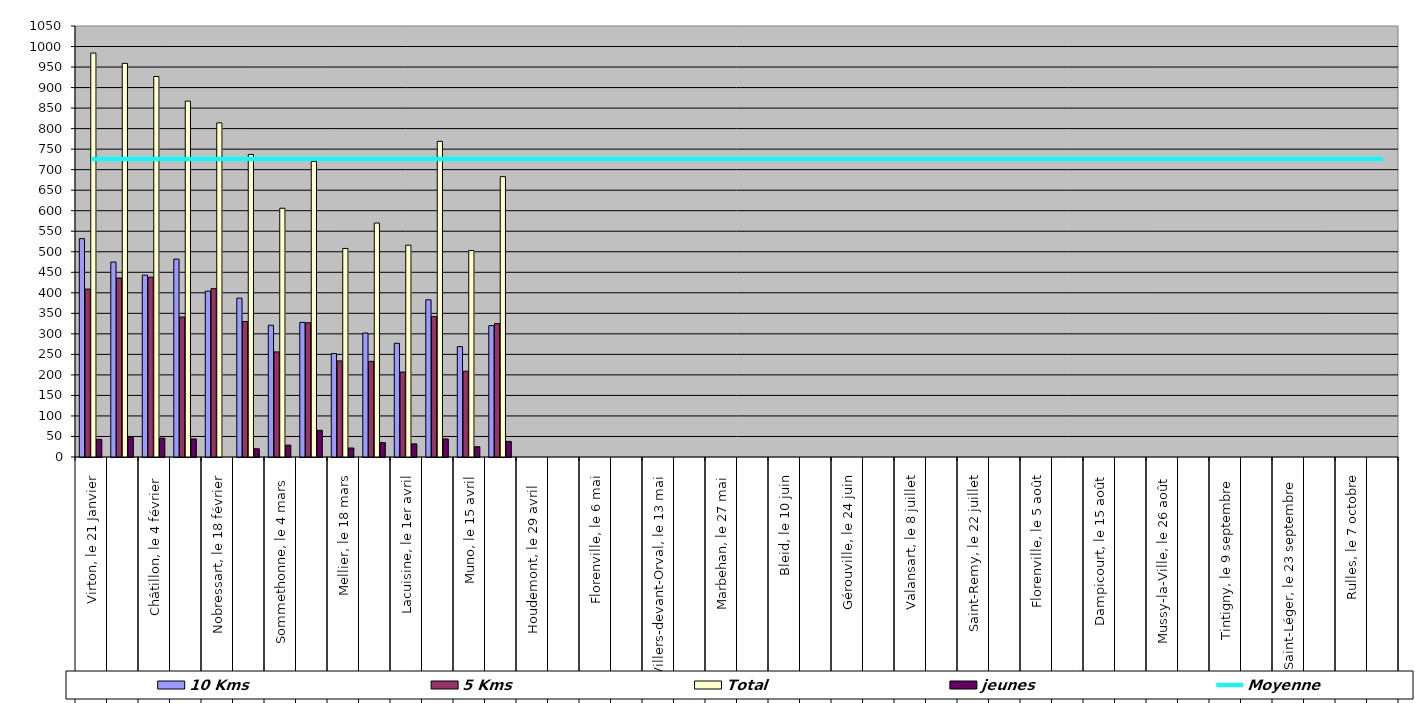
| Category | 10 Kms | 5 Kms | Total | jeunes |
|---|---|---|---|---|
| 0 | 532 | 409 | 984 | 43 |
| 1 | 475 | 436 | 959 | 48 |
| 2 | 443 | 438 | 927 | 46 |
| 3 | 482 | 341 | 867 | 44 |
| 4 | 404 | 410 | 814 | 0 |
| 5 | 387 | 330 | 737 | 20 |
| 6 | 321 | 256 | 606 | 29 |
| 7 | 328 | 327 | 720 | 65 |
| 8 | 252 | 234 | 508 | 22 |
| 9 | 302 | 233 | 570 | 35 |
| 10 | 277 | 207 | 516 | 32 |
| 11 | 383 | 342 | 769 | 44 |
| 12 | 269 | 209 | 503 | 25 |
| 13 | 320 | 325 | 683 | 38 |
| 14 | 0 | 0 | 0 | 0 |
| 15 | 0 | 0 | 0 | 0 |
| 16 | 0 | 0 | 0 | 0 |
| 17 | 0 | 0 | 0 | 0 |
| 18 | 0 | 0 | 0 | 0 |
| 19 | 0 | 0 | 0 | 0 |
| 20 | 0 | 0 | 0 | 0 |
| 21 | 0 | 0 | 0 | 0 |
| 22 | 0 | 0 | 0 | 0 |
| 23 | 0 | 0 | 0 | 0 |
| 24 | 0 | 0 | 0 | 0 |
| 25 | 0 | 0 | 0 | 0 |
| 26 | 0 | 0 | 0 | 0 |
| 27 | 0 | 0 | 0 | 0 |
| 28 | 0 | 0 | 0 | 0 |
| 29 | 0 | 0 | 0 | 0 |
| 30 | 0 | 0 | 0 | 0 |
| 31 | 0 | 0 | 0 | 0 |
| 32 | 0 | 0 | 0 | 0 |
| 33 | 0 | 0 | 0 | 0 |
| 34 | 0 | 0 | 0 | 0 |
| 35 | 0 | 0 | 0 | 0 |
| 36 | 0 | 0 | 0 | 0 |
| 37 | 0 | 0 | 0 | 0 |
| 38 | 0 | 0 | 0 | 0 |
| 39 | 0 | 0 | 0 | 0 |
| 40 | 0 | 0 | 0 | 0 |
| 41 | 0 | 0 | 0 | 0 |